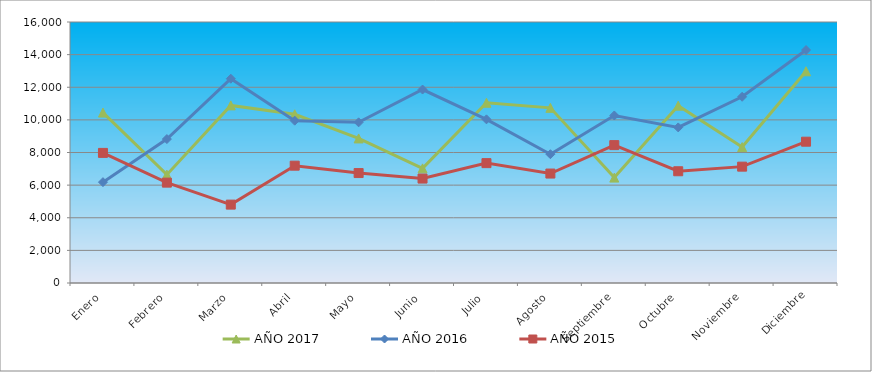
| Category | AÑO 2017 | AÑO 2016 | AÑO 2015 |
|---|---|---|---|
| Enero | 10447 | 6182 | 7976 |
| Febrero | 6642 | 8822 | 6153 |
| Marzo | 10888 | 12523 | 4805 |
| Abril | 10343 | 9951 | 7192 |
| Mayo | 8863 | 9849 | 6740 |
| Junio | 7028 | 11860 | 6402 |
| Julio | 11049 | 10033 | 7348 |
| Agosto | 10737 | 7896 | 6709 |
| Septiembre | 6461 | 10270 | 8453 |
| Octubre | 10871 | 9538 | 6850 |
| Noviembre | 8332 | 11416 | 7133 |
| Diciembre | 12978 | 14282 | 8662 |